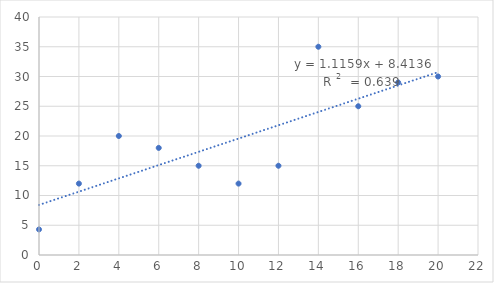
| Category | Series 0 |
|---|---|
| 0.0 | 4.3 |
| 1.9999999998835847 | 12 |
| 3.999997222214006 | 20 |
| 5.999995833321009 | 18 |
| 7.999994444428012 | 15 |
| 9.999993055535015 | 12 |
| 11.999991666642018 | 15 |
| 13.99999027774902 | 35 |
| 15.999988888856024 | 25 |
| 17.999987499963026 | 29 |
| 19.99998611107003 | 30 |